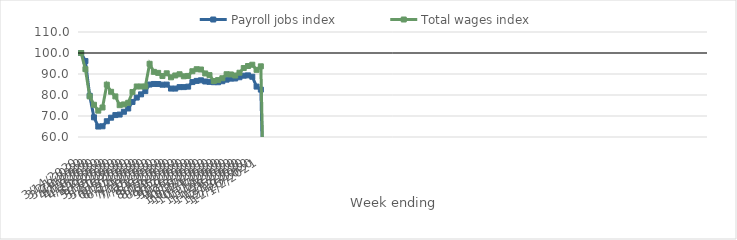
| Category | Payroll jobs index | Total wages index |
|---|---|---|
| 14/03/2020 | 100 | 100 |
| 21/03/2020 | 96.17 | 92.309 |
| 28/03/2020 | 79.642 | 79.321 |
| 04/04/2020 | 69.37 | 75.351 |
| 11/04/2020 | 64.982 | 72.548 |
| 18/04/2020 | 65.111 | 74.055 |
| 25/04/2020 | 67.513 | 84.925 |
| 02/05/2020 | 69.195 | 81.529 |
| 09/05/2020 | 70.443 | 79.328 |
| 16/05/2020 | 70.687 | 75.151 |
| 23/05/2020 | 72.02 | 75.51 |
| 30/05/2020 | 73.576 | 76.282 |
| 06/06/2020 | 76.684 | 81.434 |
| 13/06/2020 | 78.778 | 84.062 |
| 20/06/2020 | 80.308 | 84.062 |
| 27/06/2020 | 81.86 | 84.061 |
| 04/07/2020 | 84.984 | 94.852 |
| 11/07/2020 | 85.255 | 91.022 |
| 18/07/2020 | 85.223 | 90.529 |
| 25/07/2020 | 84.903 | 89.058 |
| 01/08/2020 | 84.96 | 90.332 |
| 08/08/2020 | 83.062 | 88.428 |
| 15/08/2020 | 83.058 | 89.296 |
| 22/08/2020 | 83.756 | 89.878 |
| 29/08/2020 | 83.764 | 88.907 |
| 05/09/2020 | 83.986 | 89.083 |
| 12/09/2020 | 86.155 | 91.319 |
| 19/09/2020 | 86.717 | 92.279 |
| 26/09/2020 | 86.998 | 92.141 |
| 03/10/2020 | 86.439 | 90.263 |
| 10/10/2020 | 86.252 | 89.458 |
| 17/10/2020 | 86.087 | 86.649 |
| 24/10/2020 | 86.076 | 87.101 |
| 31/10/2020 | 86.556 | 87.978 |
| 07/11/2020 | 87.303 | 89.889 |
| 14/11/2020 | 87.796 | 89.777 |
| 21/11/2020 | 87.872 | 89.291 |
| 28/11/2020 | 88.455 | 90.604 |
| 05/12/2020 | 89.194 | 92.844 |
| 12/12/2020 | 89.349 | 93.808 |
| 19/12/2020 | 88.689 | 94.416 |
| 26/12/2020 | 84.009 | 91.984 |
| 02/01/2021 | 82.57 | 93.653 |